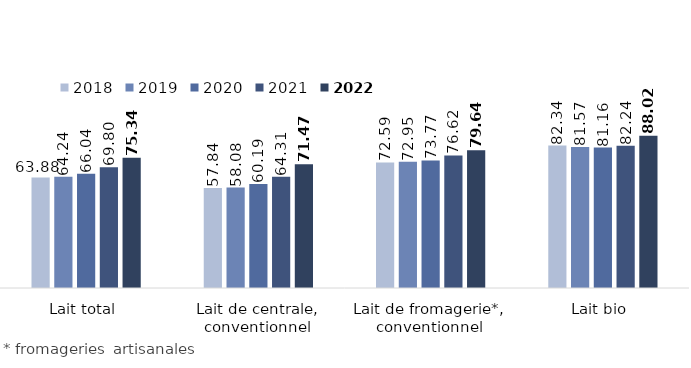
| Category | 2018 | 2019 | 2020 | 2021 | 2022 |
|---|---|---|---|---|---|
| Lait total | 63.88 | 64.237 | 66.043 | 69.798 | 75.342 |
| Lait de centrale, conventionnel | 57.837 | 58.081 | 60.187 | 64.31 | 71.475 |
| Lait de fromagerie*, conventionnel | 72.592 | 72.945 | 73.769 | 76.62 | 79.64 |
| Lait bio | 82.343 | 81.574 | 81.157 | 82.24 | 88.024 |